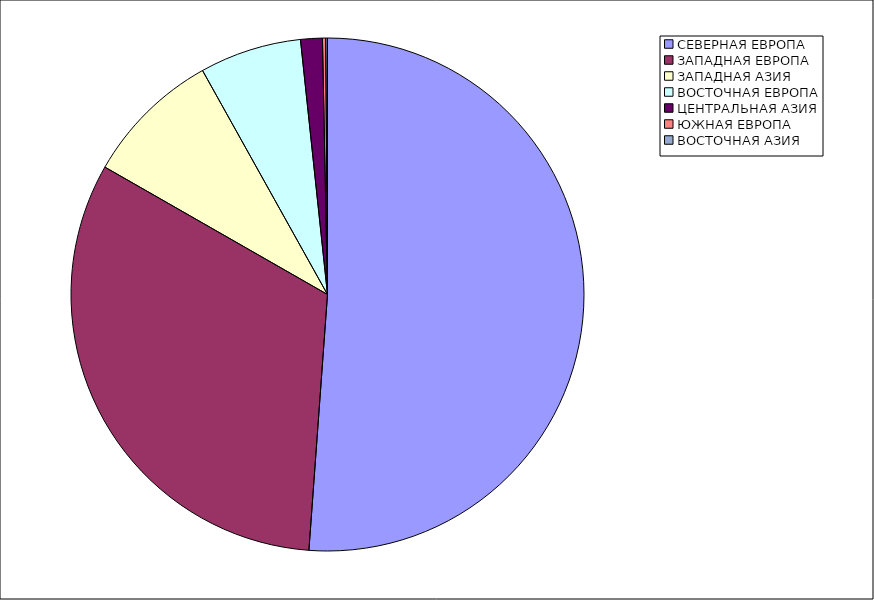
| Category | Оборот |
|---|---|
| СЕВЕРНАЯ ЕВРОПА | 51.155 |
| ЗАПАДНАЯ ЕВРОПА | 32.118 |
| ЗАПАДНАЯ АЗИЯ | 8.626 |
| ВОСТОЧНАЯ ЕВРОПА | 6.417 |
| ЦЕНТРАЛЬНАЯ АЗИЯ | 1.369 |
| ЮЖНАЯ ЕВРОПА | 0.205 |
| ВОСТОЧНАЯ АЗИЯ | 0.11 |